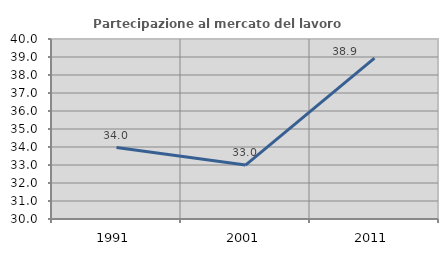
| Category | Partecipazione al mercato del lavoro  femminile |
|---|---|
| 1991.0 | 33.971 |
| 2001.0 | 32.996 |
| 2011.0 | 38.936 |